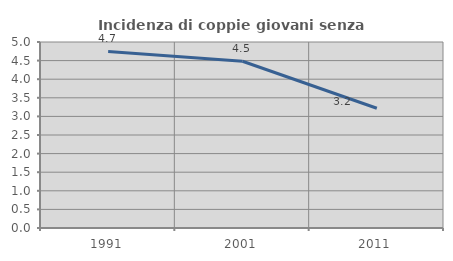
| Category | Incidenza di coppie giovani senza figli |
|---|---|
| 1991.0 | 4.745 |
| 2001.0 | 4.482 |
| 2011.0 | 3.219 |